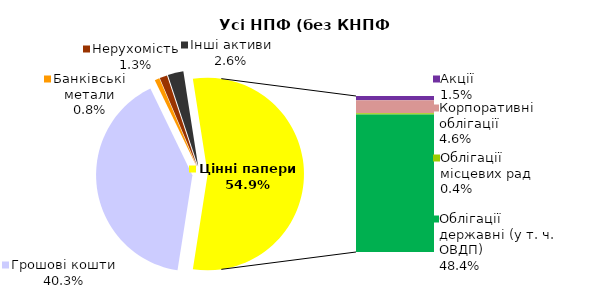
| Category | Усі НПФ (без КНПФ НБУ) |
|---|---|
| Грошові кошти | 1029.364 |
| Банківські метали | 20.695 |
| Нерухомість | 32.61 |
| Інші активи | 67.109 |
| Акції | 38.092 |
| Корпоративні облігації | 117.838 |
| Облігації місцевих рад | 11.149 |
| Облігації державні (у т. ч. ОВДП) | 1234.283 |